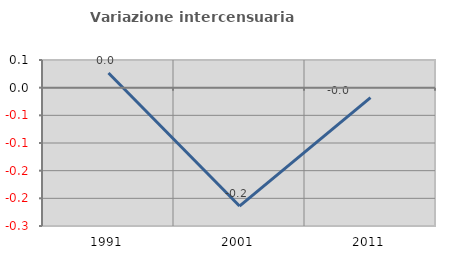
| Category | Variazione intercensuaria annua |
|---|---|
| 1991.0 | 0.027 |
| 2001.0 | -0.214 |
| 2011.0 | -0.018 |